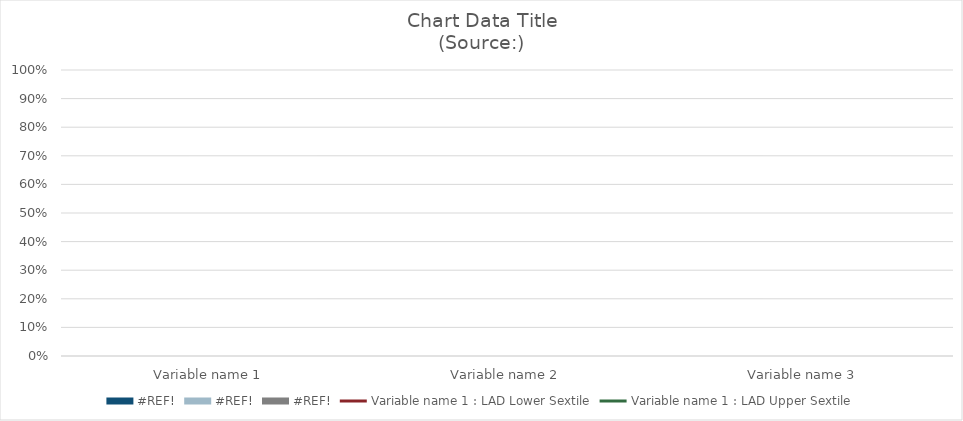
| Category | #REF! |
|---|---|
| Variable name 1 | 0 |
| Variable name 2 | 0 |
| Variable name 3 | 0 |